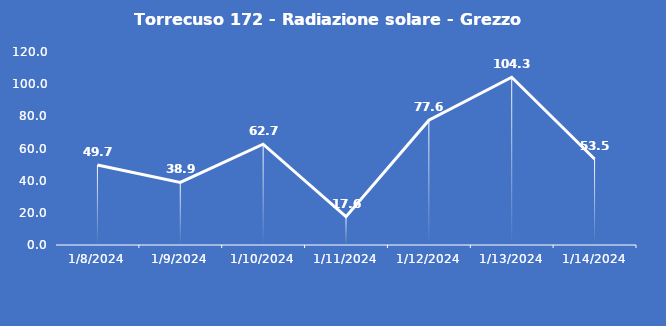
| Category | Torrecuso 172 - Radiazione solare - Grezzo (W/m2) |
|---|---|
| 1/8/24 | 49.7 |
| 1/9/24 | 38.9 |
| 1/10/24 | 62.7 |
| 1/11/24 | 17.6 |
| 1/12/24 | 77.6 |
| 1/13/24 | 104.3 |
| 1/14/24 | 53.5 |